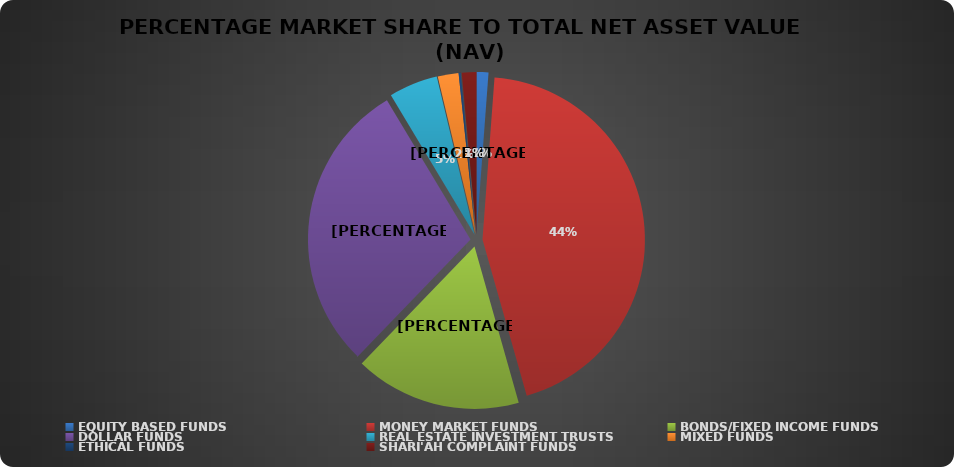
| Category | NET ASSET VALUE |
|---|---|
| EQUITY BASED FUNDS | 22687921199.81 |
| MONEY MARKET FUNDS | 854338532735.885 |
| BONDS/FIXED INCOME FUNDS | 319127187068.503 |
| DOLLAR FUNDS | 561324750435.975 |
| REAL ESTATE INVESTMENT TRUSTS | 93504922541.33 |
| MIXED FUNDS | 39909523580.557 |
| ETHICAL FUNDS | 3950705160.45 |
| SHARI'AH COMPLAINT FUNDS | 27966500870.76 |